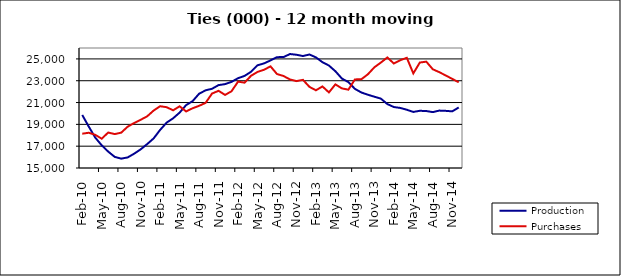
| Category | Production | Purchases |
|---|---|---|
| 2006-02-01 | 19860.435 | 18142.822 |
| 2006-03-01 | 18798.577 | 18231.973 |
| 2006-04-01 | 17788.895 | 18042.422 |
| 2006-05-01 | 17077.542 | 17685.593 |
| 2006-06-01 | 16503.382 | 18253.454 |
| 2006-07-01 | 16020.404 | 18107.794 |
| 2006-08-01 | 15856.582 | 18239.4 |
| 2006-09-01 | 15970.325 | 18788.04 |
| 2006-10-01 | 16313.459 | 19124.813 |
| 2006-11-01 | 16710.849 | 19421.05 |
| 2006-12-01 | 17190.1 | 19735.982 |
| 2007-01-01 | 17714.519 | 20267.368 |
| 2007-02-01 | 18495.045 | 20662.733 |
| 2007-03-01 | 19156.284 | 20573.808 |
| 2007-04-01 | 19557.491 | 20287.484 |
| 2007-05-01 | 20077.898 | 20655.189 |
| 2007-06-01 | 20765.665 | 20185.167 |
| 2007-07-01 | 21128.425 | 20475.06 |
| 2007-08-01 | 21807.194 | 20700.175 |
| 2007-09-01 | 22118.818 | 20969.137 |
| 2007-10-01 | 22265.055 | 21828.66 |
| 2007-11-01 | 22598.415 | 22076.202 |
| 2007-12-01 | 22689.418 | 21699.581 |
| 2008-01-01 | 22897.671 | 22034.885 |
| 2008-02-01 | 23231.411 | 22917.926 |
| 2008-03-01 | 23440.859 | 22823.2 |
| 2008-04-01 | 23818.515 | 23452.563 |
| 2008-05-01 | 24413.871 | 23806.877 |
| 2008-06-01 | 24588.394 | 24003.444 |
| 2008-07-01 | 24861.032 | 24316.991 |
| 2008-08-01 | 25161.729 | 23613.628 |
| 2008-09-01 | 25167.17 | 23434.252 |
| 2008-10-01 | 25447.846 | 23117.15 |
| 2008-11-01 | 25381.393 | 22963.606 |
| 2008-12-01 | 25264.451 | 23081.551 |
| 2009-01-01 | 25405.25 | 22435.959 |
| 2009-02-01 | 25140.11 | 22122.495 |
| 2009-03-01 | 24700.704 | 22476.498 |
| 2009-04-01 | 24392.196 | 21929.786 |
| 2009-05-01 | 23867.507 | 22666.032 |
| 2009-06-01 | 23197.845 | 22295.532 |
| 2009-07-01 | 22875.331 | 22180.968 |
| 2009-08-01 | 22255.465 | 23119.766 |
| 2009-09-01 | 21921.342 | 23138.87 |
| 2009-10-01 | 21717.58 | 23588.791 |
| 2009-11-01 | 21535.364 | 24231.321 |
| 2009-12-01 | 21359.765 | 24664.451 |
| 2010-01-01 | 20861.327 | 25131.231 |
| 2010-02-01 | 20587.907 | 24577.817 |
| 2010-03-01 | 20504.788 | 24884.209 |
| 2010-04-01 | 20340.152 | 25100.818 |
| 2010-05-01 | 20140.75 | 23672.19 |
| 2010-06-01 | 20242.709 | 24666.211 |
| 2010-07-01 | 20223.714 | 24748.858 |
| 2010-08-01 | 20123.464 | 24050.723 |
| 2010-09-01 | 20262.206 | 23784.308 |
| 2010-10-01 | 20237.921 | 23481.026 |
| 2010-11-01 | 20191.941 | 23166.266 |
| 2010-12-01 | 20549.894 | 22861.557 |